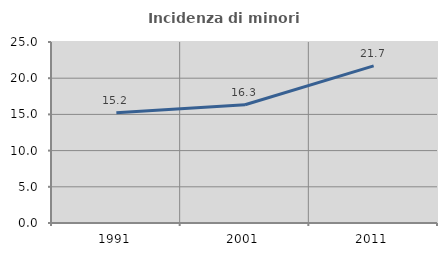
| Category | Incidenza di minori stranieri |
|---|---|
| 1991.0 | 15.217 |
| 2001.0 | 16.327 |
| 2011.0 | 21.703 |